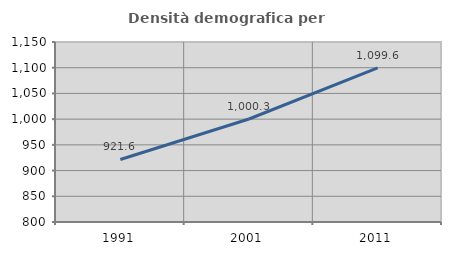
| Category | Densità demografica |
|---|---|
| 1991.0 | 921.635 |
| 2001.0 | 1000.302 |
| 2011.0 | 1099.578 |